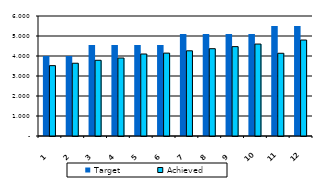
| Category | Target | Achieved  |
|---|---|---|
| 0 | 4000 | 3518 |
| 1 | 4000 | 3638 |
| 2 | 4550 | 3786 |
| 3 | 4550 | 3899 |
| 4 | 4550 | 4100 |
| 5 | 4550 | 4144 |
| 6 | 5100 | 4260 |
| 7 | 5100 | 4365 |
| 8 | 5100 | 4468 |
| 9 | 5100 | 4597 |
| 10 | 5500 | 4136 |
| 11 | 5500 | 4798 |